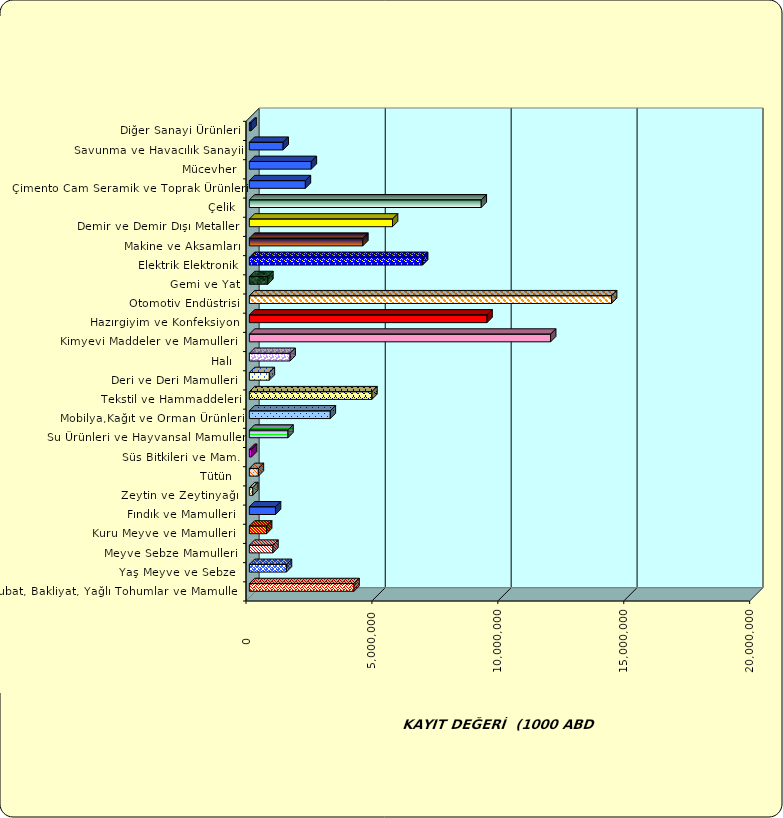
| Category | Series 0 |
|---|---|
|  Hububat, Bakliyat, Yağlı Tohumlar ve Mamulleri  | 4155642.788 |
|  Yaş Meyve ve Sebze   | 1472210.235 |
|  Meyve Sebze Mamulleri  | 936046.236 |
|  Kuru Meyve ve Mamulleri   | 685069.852 |
|  Fındık ve Mamulleri  | 1038649.182 |
|  Zeytin ve Zeytinyağı  | 136519.966 |
|  Tütün  | 357627.493 |
|  Süs Bitkileri ve Mam. | 86654.519 |
|  Su Ürünleri ve Hayvansal Mamuller | 1533967.636 |
|  Mobilya,Kağıt ve Orman Ürünleri | 3214154.11 |
|  Tekstil ve Hammaddeleri | 4866419.251 |
|  Deri ve Deri Mamulleri  | 793286.716 |
|  Halı  | 1617417.294 |
|  Kimyevi Maddeler ve Mamulleri   | 11963625.63 |
|  Hazırgiyim ve Konfeksiyon  | 9437202.285 |
|  Otomotiv Endüstrisi | 14382801.581 |
|  Gemi ve Yat | 734472.712 |
|  Elektrik Elektronik | 6880115.546 |
|  Makine ve Aksamları | 4505770.209 |
|  Demir ve Demir Dışı Metaller  | 5685240.901 |
|  Çelik | 9208551.935 |
|  Çimento Cam Seramik ve Toprak Ürünleri | 2224996.768 |
|  Mücevher | 2460776.656 |
|  Savunma ve Havacılık Sanayii | 1341847.86 |
|  Diğer Sanayi Ürünleri | 66783.725 |